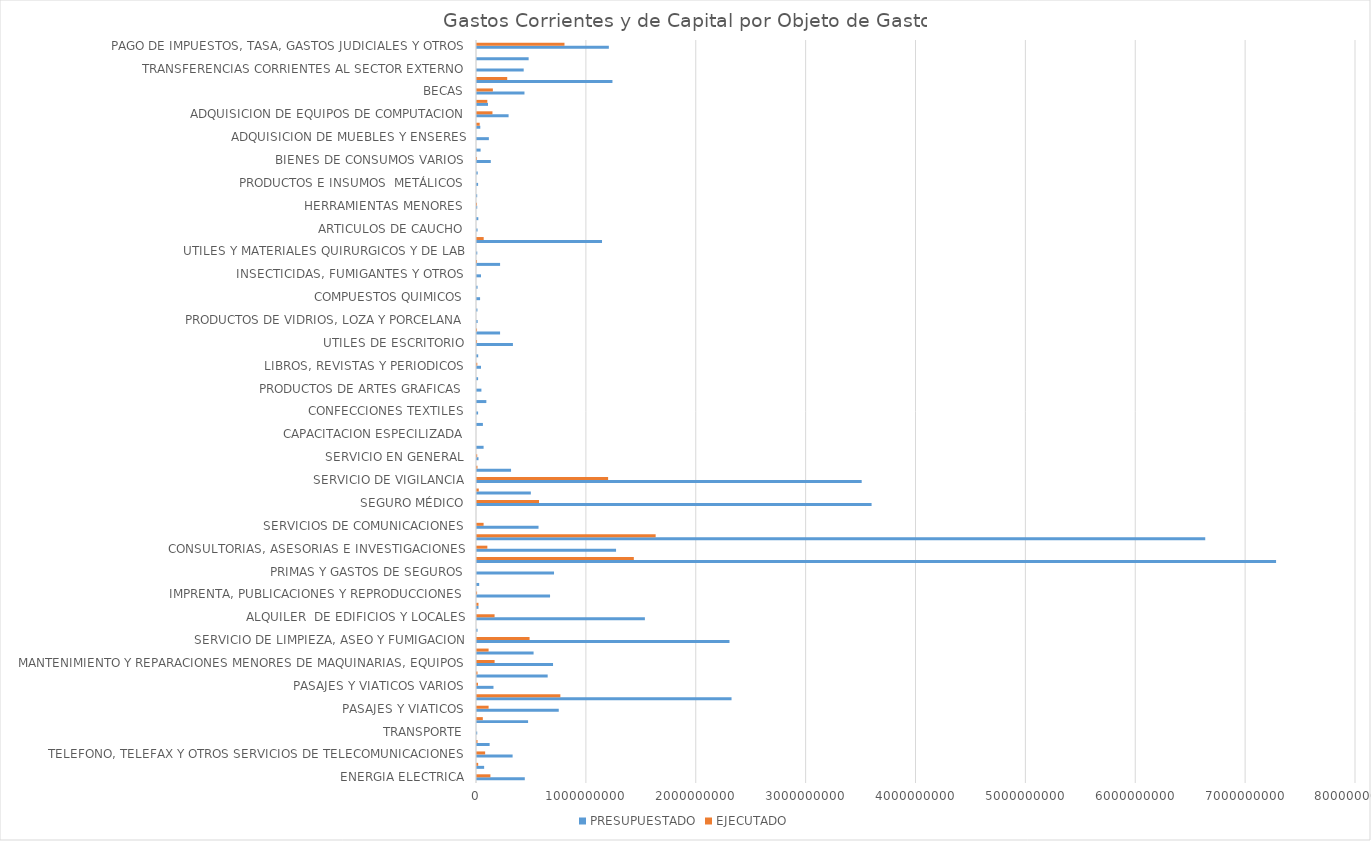
| Category | PRESUPUESTADO | EJECUTADO |
|---|---|---|
| ENERGIA ELECTRICA | 435000000 | 121972634 |
| AGUA | 64950000 | 10858070 |
| TELEFONO, TELEFAX Y OTROS SERVICIOS DE TELECOMUNICACIONES | 324050000 | 74122912 |
| CORREOS Y OTROS SERVICIOS POSTALES | 115000000 | 4610000 |
| TRANSPORTE | 2000000 | 0 |
| TRANSPORTE DE PERSONAS | 465000000 | 53010300 |
| PASAJES Y VIATICOS | 744093694 | 105573348 |
| VIATICOS Y MOVILIDAD | 2316633885 | 758654205 |
| PASAJES Y VIATICOS VARIOS | 150000000 | 9014150 |
| MANTENIMIENTO Y REPARACIONES MENORES DE EDIFICIOS Y LOCALES | 643291264 | 4480000 |
| MANTENIMIENTO Y REPARACIONES MENORES DE MAQUINARIAS, EQUIPOS | 692000000 | 160298506 |
| MANTEMIENTOS Y REPARACIONES MENORES DE EQUIPOS DE TRANSPORTE | 515000000 | 105572208 |
| SERVICIO DE LIMPIEZA, ASEO Y FUMIGACION | 2298000000 | 478366997 |
| MANTENIMIENTO Y REPACIONES MENORES DE INSTALACIONES | 5000000 | 0 |
| ALQUILER  DE EDIFICIOS Y LOCALES | 1528000000 | 160000000 |
| DE INFORMATICA Y SISTEMAS COMPUTARIZADOS | 13400000 | 13400000 |
| IMPRENTA, PUBLICACIONES Y REPRODUCCIONES | 664899992 | 800000 |
| SERVICIOS BANCARIOS | 20000000 | 0 |
| PRIMAS Y GASTOS DE SEGUROS | 701000000 | 0 |
| PUBLICIDAD Y PROPAGANDA | 7272558189 | 1427294766 |
| CONSULTORIAS, ASESORIAS E INVESTIGACIONES | 1265545357 | 94181666 |
| PROMOCIONES Y EXPOSICIONES | 6627882000 | 1625984862 |
| SERVICIOS DE COMUNICACIONES | 560000000 | 60000000 |
| SERVICIOS TECNICOS Y PROFESIONALES | 0 | 0 |
| SEGURO MÉDICO | 3591190000 | 564535413 |
| SERVICIO DE CEREMONIAL | 490000000 | 16040748 |
| SERVICIO DE VIGILANCIA | 3501206250 | 1193295972 |
| SERVICIO DE CATERING | 310000570 | 4300000 |
| SERVICIO EN GENERAL | 13702500 | 1930500 |
| CAPACITACION DEL PERSONAL  DEL ESTADO | 60000000 | 0 |
| CAPACITACION ESPECILIZADA | 0 | 0 |
| ALIMENTOS PARA LAS PERSONAS | 53664000 | 0 |
| CONFECCIONES TEXTILES | 10000000 | 0 |
| PAPEL DE ESCRITORIO Y CARTON | 85000000 | 0 |
| PRODUCTOS DE ARTES GRAFICAS | 40089000 | 0 |
| PRODUCTOS DE PAPEL Y CARTON | 10000000 | 0 |
| LIBROS, REVISTAS Y PERIODICOS | 36195500 | 2778500 |
| ELEMENTOS DE LIMPIEZA | 10937500 | 0 |
| UTILES DE ESCRITORIO | 326929755 | 440000 |
| UTILES Y MATERIALES ELECTRICOS | 210000000 | 300000 |
| PRODUCTOS DE VIDRIOS, LOZA Y PORCELANA | 5850000 | 0 |
| REPUESTOS Y ACCESORIOS MENORES | 4000000 | 0 |
| COMPUESTOS QUIMICOS | 28000000 | 0 |
| PRODUCTOS FARMACEUTICOS | 5000000 | 0 |
| INSECTICIDAS, FUMIGANTES Y OTROS | 36250000 | 0 |
| TINTAS, PINTURAS Y COLORANTES | 210095750 | 207000 |
| UTILES Y MATERIALES QUIRURGICOS Y DE LAB | 2560000 | 0 |
| COMBUSTIBLES  | 1137784000 | 60823362 |
| ARTICULOS DE CAUCHO | 5140000 | 0 |
| CUBIERTAS Y CÁMARAS DE AIRE | 12000000 | 0 |
| HERRAMIENTAS MENORES | 2000000 | 133000 |
| ARTICULOS DE PLASTICOS | 1710000 | 0 |
| PRODUCTOS E INSUMOS  METÁLICOS | 10000000 | 0 |
| PRODUCTOS E INSUMOS NO METÁLICOS | 6500000 | 0 |
| BIENES DE CONSUMOS VARIOS | 125540000 | 117500 |
| HERRAMIENTAS, APARATOS E INSTRUMENTOS EN GRAL  | 32800000 | 0 |
| ADQUISICION DE MUEBLES Y ENSERES | 108000000 | 0 |
| ADQUISICION DE EQUIPOS DE OFICINA Y COMPUTACIÓN | 30000000 | 24564000 |
| ADQUISICION DE EQUIPOS DE COMPUTACION | 287500000 | 140724000 |
| ACTIVOS INTAGIBLES | 100000000 | 93775000 |
| BECAS | 432000000 | 144360000 |
| APORTE A ENTIDADES EDUCATIVAS E INST. SIN FINES DE LUCRO | 1232766742 | 275000000 |
| TRANSFERENCIAS CORRIENTES AL SECTOR EXTERNO | 425000000 | 0 |
| TRANSFERENCIAS CORRIENTES DEL SECTOR PRIVADO | 470000000 | 0 |
| PAGO DE IMPUESTOS, TASA, GASTOS JUDICIALES Y OTROS | 1200000000 | 796184946 |